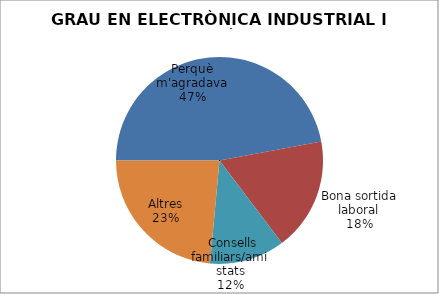
| Category | GRAU EN ELECTRÒNICA INDUSTRIAL I AUTOMÀTICA |
|---|---|
| Perquè m'agradava | 8 |
| Bona sortida laboral | 3 |
| S'hi matriculaven les amistats | 0 |
| Nota de tall | 0 |
|  Consells familiars/amistats | 2 |
| Altres | 4 |